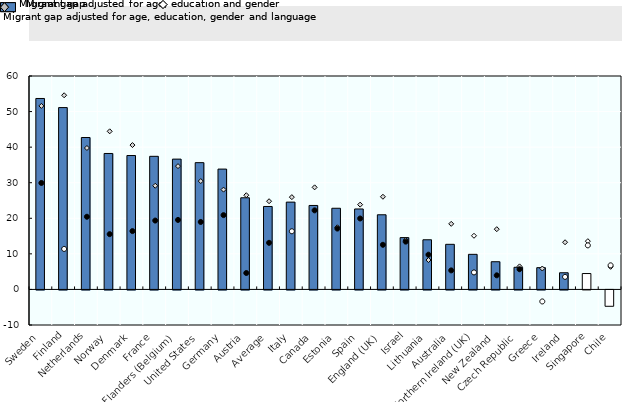
| Category | Migrant gap |
|---|---|
| Sweden | 53.681 |
| Finland | 51.121 |
| Netherlands | 42.71 |
| Norway | 38.218 |
| Denmark | 37.644 |
| France | 37.422 |
| Flanders (Belgium) | 36.632 |
| United States | 35.642 |
| Germany | 33.831 |
| Austria | 25.765 |
| Average | 23.32 |
| Italy | 24.547 |
| Canada | 23.603 |
| Estonia | 22.817 |
| Spain | 22.616 |
| England (UK) | 20.989 |
| Israel | 14.568 |
| Lithuania | 13.96 |
| Australia | 12.683 |
| Northern Ireland (UK) | 9.867 |
| New Zealand | 7.79 |
| Czech Republic | 6.219 |
| Greece | 6.12 |
| Ireland | 4.688 |
| Singapore | 4.469 |
| Chile | -4.601 |